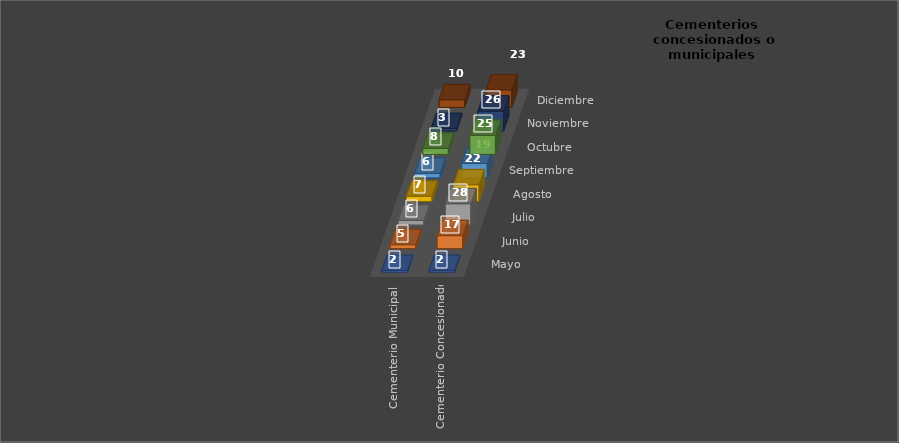
| Category | Mayo  | Junio | Julio | Agosto | Septiembre | Octubre | Noviembre | Diciembre |
|---|---|---|---|---|---|---|---|---|
| Cementerio Municipal  | 2 | 5 | 6 | 7 | 8 | 6 | 3 | 10 |
| Cementerio Concesionado | 2 | 17 | 28 | 22 | 25 | 19 | 26 | 23 |